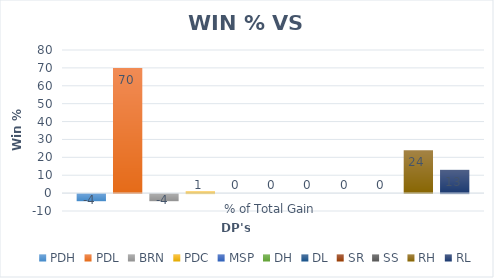
| Category | PDH | PDL | BRN | PDC | MSP | DH | DL | SR | SS | RH | RL |
|---|---|---|---|---|---|---|---|---|---|---|---|
| % of Total Gain | -4 | 70 | -4 | 1 | 0 | 0 | 0 | 0 | 0 | 24 | 13 |